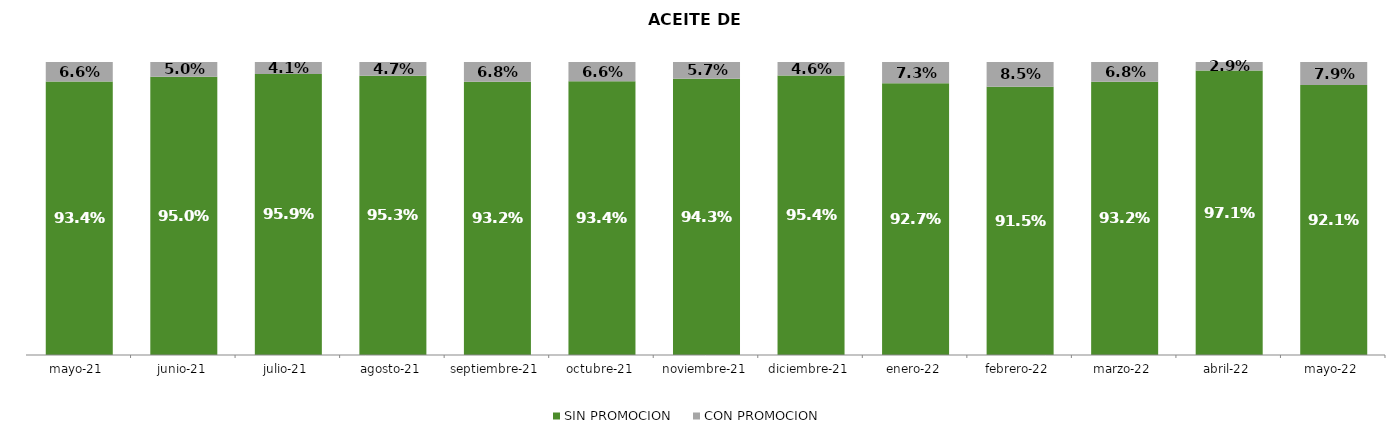
| Category | SIN PROMOCION   | CON PROMOCION   |
|---|---|---|
| 2021-05-01 | 0.934 | 0.066 |
| 2021-06-01 | 0.95 | 0.05 |
| 2021-07-01 | 0.959 | 0.041 |
| 2021-08-01 | 0.953 | 0.047 |
| 2021-09-01 | 0.932 | 0.068 |
| 2021-10-01 | 0.934 | 0.066 |
| 2021-11-01 | 0.943 | 0.057 |
| 2021-12-01 | 0.954 | 0.046 |
| 2022-01-01 | 0.927 | 0.073 |
| 2022-02-01 | 0.915 | 0.085 |
| 2022-03-01 | 0.932 | 0.068 |
| 2022-04-01 | 0.971 | 0.029 |
| 2022-05-01 | 0.921 | 0.079 |